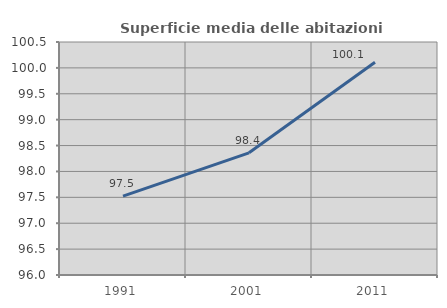
| Category | Superficie media delle abitazioni occupate |
|---|---|
| 1991.0 | 97.523 |
| 2001.0 | 98.359 |
| 2011.0 | 100.108 |